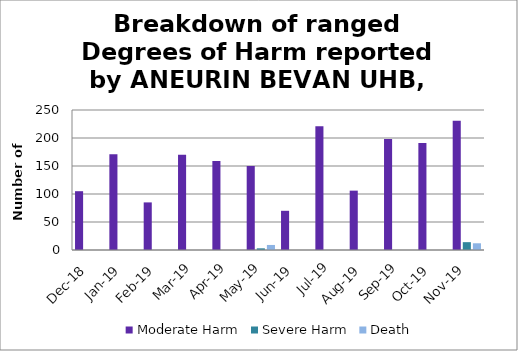
| Category | Moderate Harm | Severe Harm | Death |
|---|---|---|---|
| Dec-18 | 105 | 0 | 0 |
| Jan-19 | 171 | 0 | 0 |
| Feb-19 | 85 | 0 | 0 |
| Mar-19 | 170 | 0 | 0 |
| Apr-19 | 159 | 0 | 0 |
| May-19 | 150 | 3 | 9 |
| Jun-19 | 70 | 0 | 0 |
| Jul-19 | 221 | 0 | 0 |
| Aug-19 | 106 | 0 | 0 |
| Sep-19 | 198 | 0 | 0 |
| Oct-19 | 191 | 0 | 0 |
| Nov-19 | 231 | 14 | 12 |